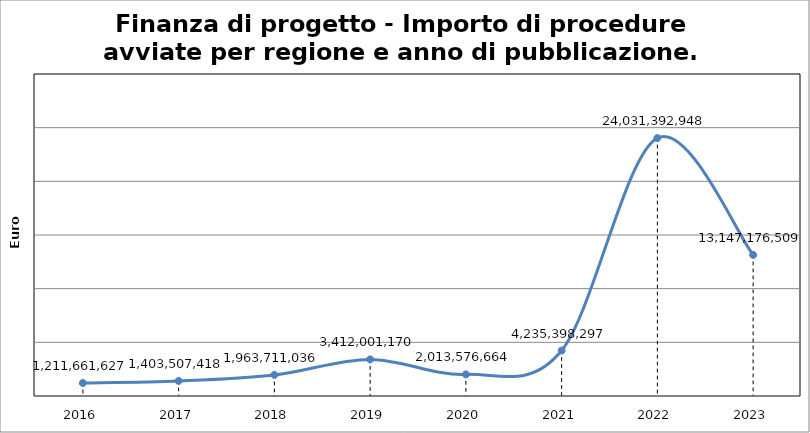
| Category | Series 0 |
|---|---|
| 2016.0 | 1211661627 |
| 2017.0 | 1403507418 |
| 2018.0 | 1963711036 |
| 2019.0 | 3412001170 |
| 2020.0 | 2013576664 |
| 2021.0 | 4235398297 |
| 2022.0 | 24031392948 |
| 2023.0 | 13147176509 |